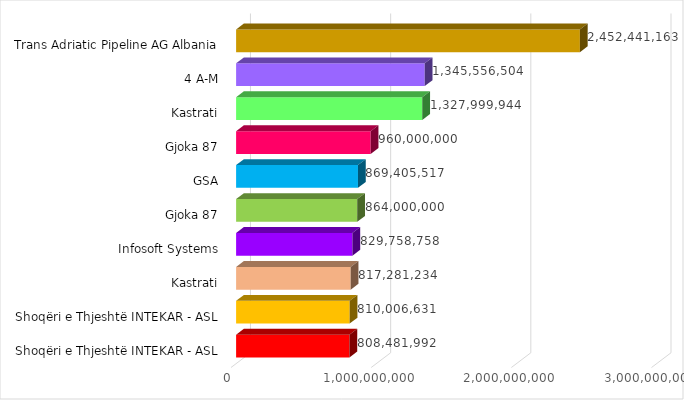
| Category | Transaksioni (në Lekë) |
|---|---|
| Shoqëri e Thjeshtë INTEKAR - ASL | 808481992 |
| Shoqëri e Thjeshtë INTEKAR - ASL | 810006631 |
| Kastrati | 817281234 |
| Infosoft Systems | 829758758 |
| Gjoka 87 | 864000000 |
| GSA | 869405517 |
| Gjoka 87 | 960000000 |
| Kastrati | 1327999944 |
| 4 A-M | 1345556504 |
| Trans Adriatic Pipeline AG Albania | 2452441163 |